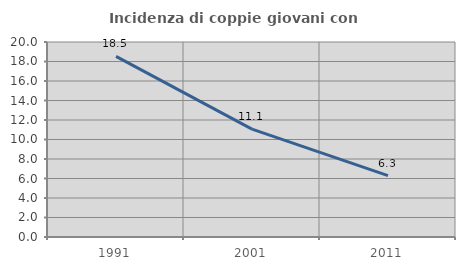
| Category | Incidenza di coppie giovani con figli |
|---|---|
| 1991.0 | 18.526 |
| 2001.0 | 11.069 |
| 2011.0 | 6.292 |